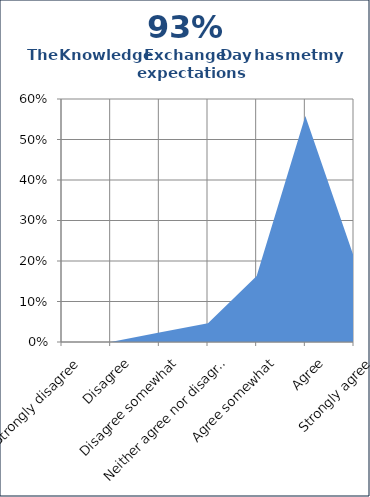
| Category | Series 1 |
|---|---|
| Strongly disagree | 0 |
| Disagree | 0 |
| Disagree somewhat | 0.023 |
| Neither agree nor disagree | 0.047 |
| Agree somewhat | 0.163 |
| Agree | 0.558 |
| Strongly agree | 0.209 |